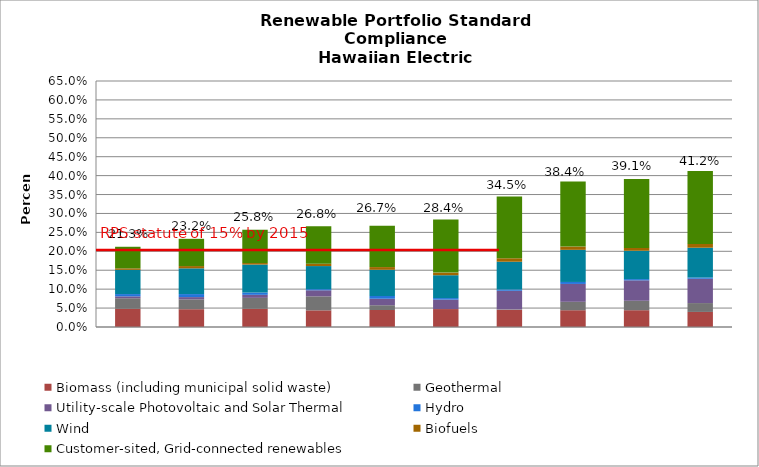
| Category | Biomass (including municipal solid waste) | Geothermal | Utility-scale Photovoltaic and Solar Thermal | Hydro | Wind | Biofuels | Customer-sited, Grid-connected renewables |
|---|---|---|---|---|---|---|---|
| 2014.0 | 0.048 | 0.028 | 0.005 | 0.006 | 0.064 | 0.004 | 0.057 |
| 2015.0 | 0.047 | 0.026 | 0.006 | 0.008 | 0.068 | 0.006 | 0.072 |
| 2016.0 | 0.048 | 0.029 | 0.008 | 0.006 | 0.074 | 0.004 | 0.088 |
| 2017.0 | 0.044 | 0.037 | 0.016 | 0.003 | 0.061 | 0.006 | 0.099 |
| 2018.0 | 0.045 | 0.013 | 0.017 | 0.007 | 0.069 | 0.007 | 0.109 |
| 2019.0 | 0.047 | 0 | 0.025 | 0.004 | 0.06 | 0.007 | 0.14 |
| 2020.0 | 0.045 | 0.001 | 0.049 | 0.004 | 0.073 | 0.009 | 0.163 |
| 2021.0 | 0.044 | 0.022 | 0.047 | 0.005 | 0.085 | 0.009 | 0.172 |
| 2022.0 | 0.044 | 0.025 | 0.054 | 0.003 | 0.075 | 0.008 | 0.182 |
| 2023.0 | 0.04 | 0.023 | 0.064 | 0.003 | 0.079 | 0.01 | 0.193 |